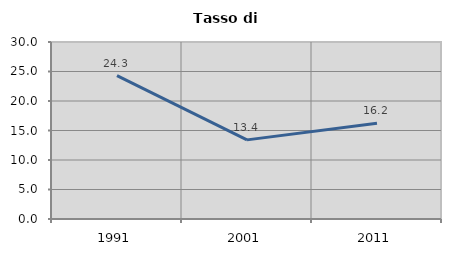
| Category | Tasso di disoccupazione   |
|---|---|
| 1991.0 | 24.303 |
| 2001.0 | 13.412 |
| 2011.0 | 16.247 |